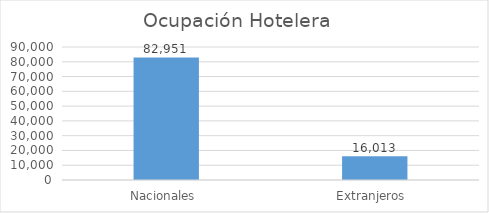
| Category | Series 0 |
|---|---|
| Nacionales  | 82951 |
| Extranjeros  | 16013 |